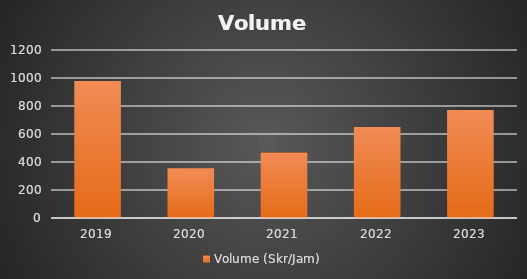
| Category | Volume (Skr/Jam) |
|---|---|
| 2019.0 | 979.287 |
| 2020.0 | 354.914 |
| 2021.0 | 467.639 |
| 2022.0 | 650.27 |
| 2023.0 | 771.838 |